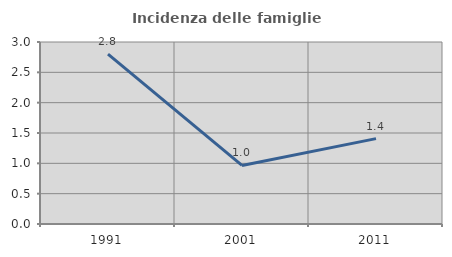
| Category | Incidenza delle famiglie numerose |
|---|---|
| 1991.0 | 2.802 |
| 2001.0 | 0.965 |
| 2011.0 | 1.407 |